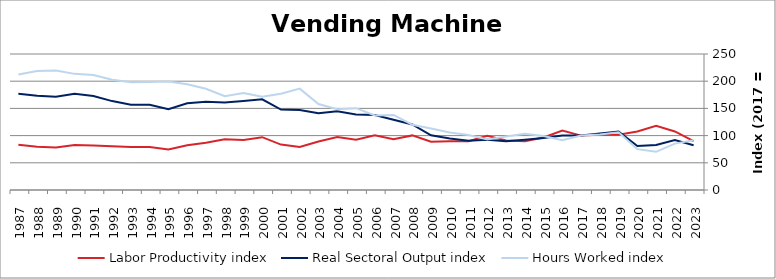
| Category | Labor Productivity index | Real Sectoral Output index | Hours Worked index |
|---|---|---|---|
| 2023.0 | 90.011 | 82.379 | 91.521 |
| 2022.0 | 107.679 | 91.819 | 85.27 |
| 2021.0 | 118.015 | 82.826 | 70.182 |
| 2020.0 | 107.518 | 80.76 | 75.113 |
| 2019.0 | 101.402 | 107.449 | 105.963 |
| 2018.0 | 101.785 | 103.872 | 102.05 |
| 2017.0 | 100 | 100 | 100 |
| 2016.0 | 109.37 | 100.316 | 91.722 |
| 2015.0 | 96.522 | 95.763 | 99.213 |
| 2014.0 | 89.471 | 92.338 | 103.204 |
| 2013.0 | 91.043 | 89.576 | 98.388 |
| 2012.0 | 99.458 | 92.472 | 92.975 |
| 2011.0 | 89.615 | 90.434 | 100.913 |
| 2010.0 | 89.478 | 94.628 | 105.756 |
| 2009.0 | 88.905 | 100.562 | 113.111 |
| 2008.0 | 100.36 | 120.518 | 120.086 |
| 2007.0 | 93.489 | 129.058 | 138.045 |
| 2006.0 | 100.671 | 137.923 | 137.004 |
| 2005.0 | 92.397 | 138.975 | 150.411 |
| 2004.0 | 97.364 | 144.554 | 148.468 |
| 2003.0 | 89.25 | 141.001 | 157.985 |
| 2002.0 | 79.023 | 147.252 | 186.34 |
| 2001.0 | 83.46 | 147.813 | 177.106 |
| 2000.0 | 97.097 | 166.652 | 171.634 |
| 1999.0 | 91.793 | 163.783 | 178.427 |
| 1998.0 | 93.267 | 160.769 | 172.375 |
| 1997.0 | 87.038 | 162.004 | 186.129 |
| 1996.0 | 82.064 | 159.595 | 194.475 |
| 1995.0 | 74.588 | 148.685 | 199.343 |
| 1994.0 | 78.977 | 156.844 | 198.594 |
| 1993.0 | 79.087 | 156.644 | 198.066 |
| 1992.0 | 80.626 | 163.415 | 202.682 |
| 1991.0 | 81.763 | 172.832 | 211.381 |
| 1990.0 | 82.88 | 176.926 | 213.471 |
| 1989.0 | 77.944 | 171.367 | 219.859 |
| 1988.0 | 79.295 | 173.429 | 218.713 |
| 1987.0 | 83.187 | 176.723 | 212.441 |